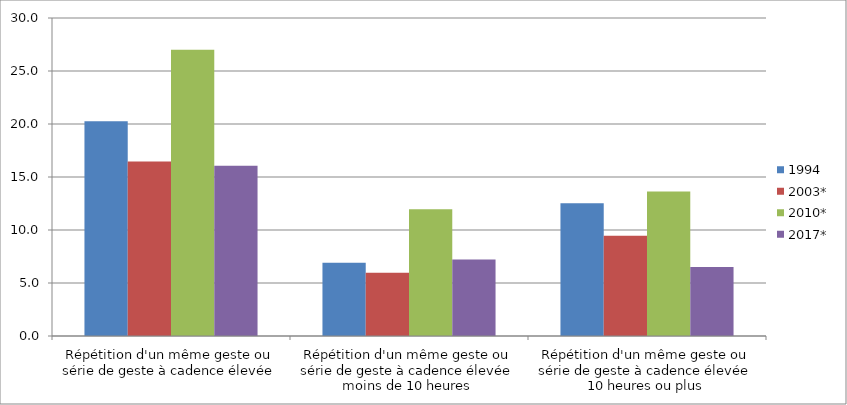
| Category | 1994 | 2003* | 2010* | 2017* |
|---|---|---|---|---|
| Répétition d'un même geste ou série de geste à cadence élevée | 20.27 | 16.46 | 27 | 16.06 |
| Répétition d'un même geste ou série de geste à cadence élevée moins de 10 heures | 6.9 | 5.96 | 11.95 | 7.22 |
| Répétition d'un même geste ou série de geste à cadence élevée 10 heures ou plus | 12.53 | 9.45 | 13.63 | 6.51 |